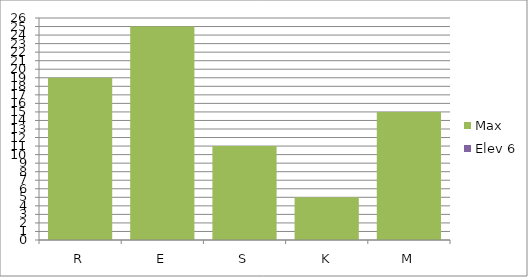
| Category | Max | Elev 6 |
|---|---|---|
| R | 19 | 0 |
| E | 25 | 0 |
| S | 11 | 0 |
| K | 5 | 0 |
| M | 15 | 0 |